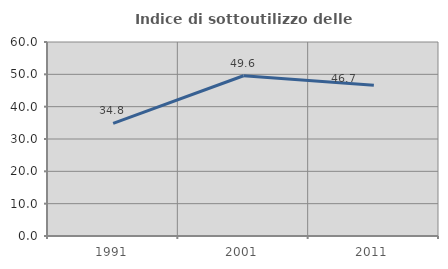
| Category | Indice di sottoutilizzo delle abitazioni  |
|---|---|
| 1991.0 | 34.813 |
| 2001.0 | 49.571 |
| 2011.0 | 46.653 |